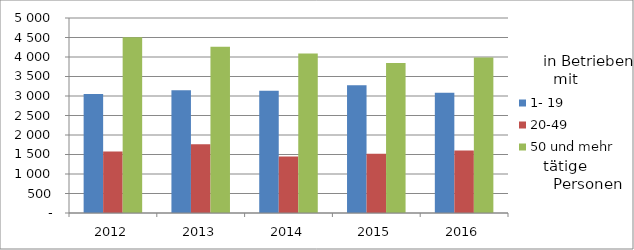
| Category | 1- 19 | 20-49 | 50 und mehr |
|---|---|---|---|
| 2012.0 | 3052 | 1576 | 4508 |
| 2013.0 | 3148 | 1760 | 4264 |
| 2014.0 | 3136 | 1450 | 4090 |
| 2015.0 | 3275 | 1522 | 3844 |
| 2016.0 | 3086 | 1603 | 3988 |